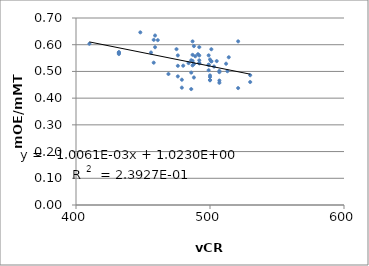
| Category | Series 0 |
|---|---|
| 480.0 | 0.521 |
| 484.0 | 0.531 |
| 487.0 | 0.612 |
| 487.0 | 0.562 |
| 487.0 | 0.539 |
| 487.0 | 0.523 |
| 500.0 | 0.545 |
| 500.0 | 0.468 |
| 500.0 | 0.479 |
| 500.0 | 0.467 |
| 500.0 | 0.485 |
| 507.0 | 0.502 |
| 521.0 | 0.438 |
| 521.0 | 0.613 |
| 530.0 | 0.486 |
| 488.0 | 0.528 |
| 491.0 | 0.564 |
| 492.0 | 0.531 |
| 492.0 | 0.591 |
| 492.0 | 0.56 |
| 492.0 | 0.542 |
| 492.0 | 0.53 |
| 507.0 | 0.497 |
| 507.0 | 0.466 |
| 507.0 | 0.457 |
| 513.0 | 0.501 |
| 505.0 | 0.539 |
| 488.0 | 0.595 |
| 488.0 | 0.477 |
| 489.0 | 0.557 |
| 486.0 | 0.495 |
| 476.0 | 0.56 |
| 476.0 | 0.481 |
| 476.0 | 0.521 |
| 479.0 | 0.439 |
| 479.0 | 0.469 |
| 501.0 | 0.583 |
| 503.0 | 0.518 |
| 501.0 | 0.538 |
| 501.0 | 0.538 |
| 499.0 | 0.56 |
| 499.0 | 0.525 |
| 499.0 | 0.505 |
| 499.0 | 0.524 |
| nan | 0.557 |
| 475.0 | 0.583 |
| 530.0 | 0.46 |
| nan | 0.473 |
| nan | 0.436 |
| nan | 0.452 |
| 512.0 | 0.529 |
| 486.0 | 0.434 |
| 486.0 | 0.542 |
| 469.0 | 0.49 |
| 458.0 | 0.618 |
| 514.0 | 0.553 |
| 458.0 | 0.533 |
| 448.0 | 0.646 |
| 432.0 | 0.572 |
| 432.0 | 0.571 |
| 432.0 | 0.565 |
| 432.0 | 0.568 |
| 459.0 | 0.634 |
| 459.0 | 0.591 |
| 410.0 | 0.603 |
| 461.0 | 0.617 |
| 456.0 | 0.571 |